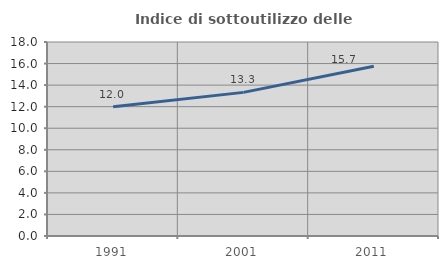
| Category | Indice di sottoutilizzo delle abitazioni  |
|---|---|
| 1991.0 | 11.99 |
| 2001.0 | 13.326 |
| 2011.0 | 15.743 |